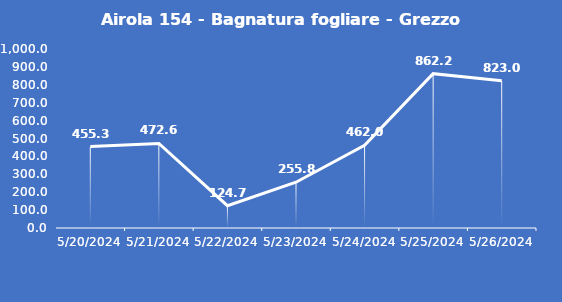
| Category | Airola 154 - Bagnatura fogliare - Grezzo (min) |
|---|---|
| 5/20/24 | 455.3 |
| 5/21/24 | 472.6 |
| 5/22/24 | 124.7 |
| 5/23/24 | 255.8 |
| 5/24/24 | 462 |
| 5/25/24 | 862.2 |
| 5/26/24 | 823 |